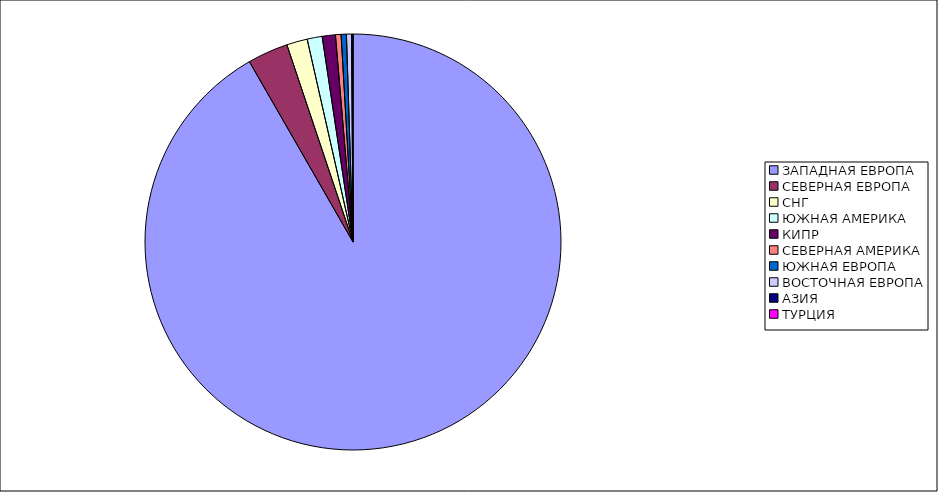
| Category | Оборот |
|---|---|
| ЗАПАДНАЯ ЕВРОПА | 0.917 |
| СЕВЕРНАЯ ЕВРОПА | 0.032 |
| СНГ | 0.016 |
| ЮЖНАЯ АМЕРИКА | 0.012 |
| КИПР | 0.01 |
| СЕВЕРНАЯ АМЕРИКА | 0.004 |
| ЮЖНАЯ ЕВРОПА | 0.004 |
| ВОСТОЧНАЯ ЕВРОПА | 0.004 |
| АЗИЯ | 0.001 |
| ТУРЦИЯ | 0 |